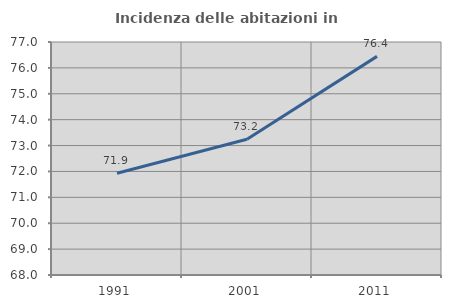
| Category | Incidenza delle abitazioni in proprietà  |
|---|---|
| 1991.0 | 71.928 |
| 2001.0 | 73.245 |
| 2011.0 | 76.444 |